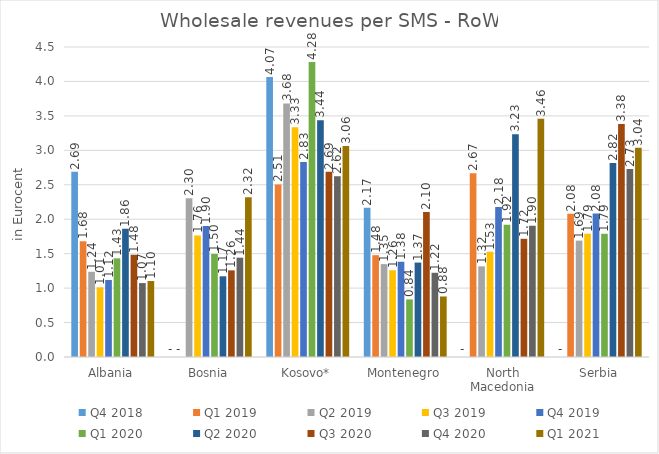
| Category | Q4 2018 | Q1 2019 | Q2 2019 | Q3 2019 | Q4 2019 | Q1 2020 | Q2 2020 | Q3 2020 | Q4 2020 | Q1 2021 |
|---|---|---|---|---|---|---|---|---|---|---|
| Albania | 2.69 | 1.68 | 1.237 | 1.011 | 1.118 | 1.432 | 1.861 | 1.484 | 1.073 | 1.103 |
| Bosnia | 0 | 0 | 2.303 | 1.764 | 1.903 | 1.496 | 1.171 | 1.258 | 1.442 | 2.318 |
| Kosovo* | 4.066 | 2.506 | 3.68 | 3.334 | 2.829 | 4.281 | 3.437 | 2.69 | 2.623 | 3.065 |
| Montenegro | 2.167 | 1.478 | 1.348 | 1.259 | 1.383 | 0.836 | 1.371 | 2.104 | 1.223 | 0.879 |
| North Macedonia | 0 | 2.669 | 1.316 | 1.528 | 2.177 | 1.919 | 3.233 | 1.716 | 1.905 | 3.458 |
| Serbia | 0 | 2.079 | 1.69 | 1.79 | 2.083 | 1.788 | 2.815 | 3.381 | 2.729 | 3.037 |